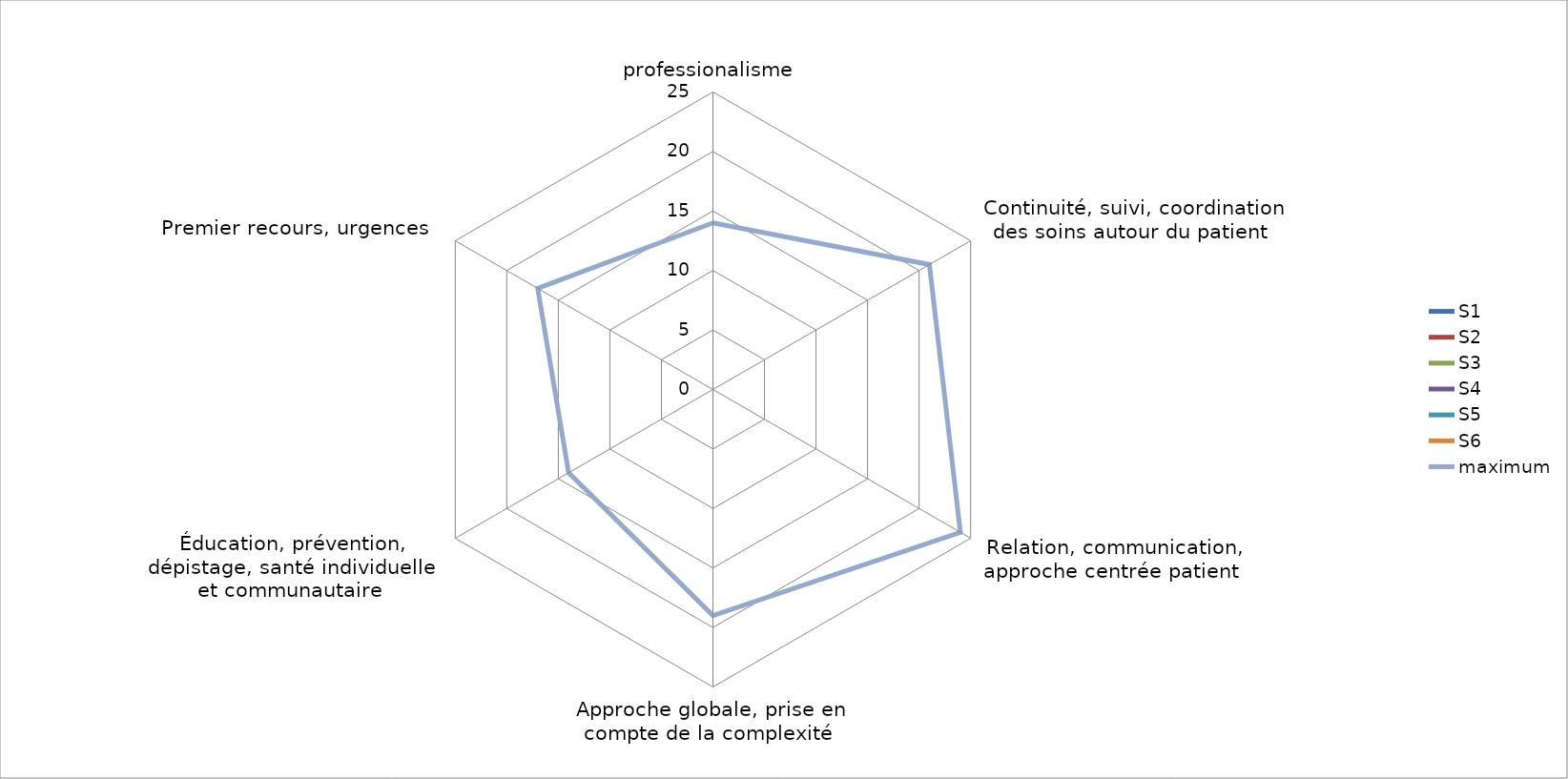
| Category | S1 | S2 | S3 | S4 | S5 | S6 | maximum |
|---|---|---|---|---|---|---|---|
| professionalisme | 0 | 0 | 0 | 0 | 0 | 0 | 14 |
| Continuité, suivi, coordination des soins autour du patient  | 0 | 0 | 0 | 0 | 0 | 0 | 21 |
| Relation, communication, approche centrée patient  | 0 | 0 | 0 | 0 | 0 | 0 | 24 |
| Approche globale, prise en compte de la complexité  | 0 | 0 | 0 | 0 | 0 | 0 | 19 |
| Éducation, prévention, dépistage, santé individuelle et communautaire  | 0 | 0 | 0 | 0 | 0 | 0 | 14 |
| Premier recours, urgences  | 0 | 0 | 0 | 0 | 0 | 0 | 17 |